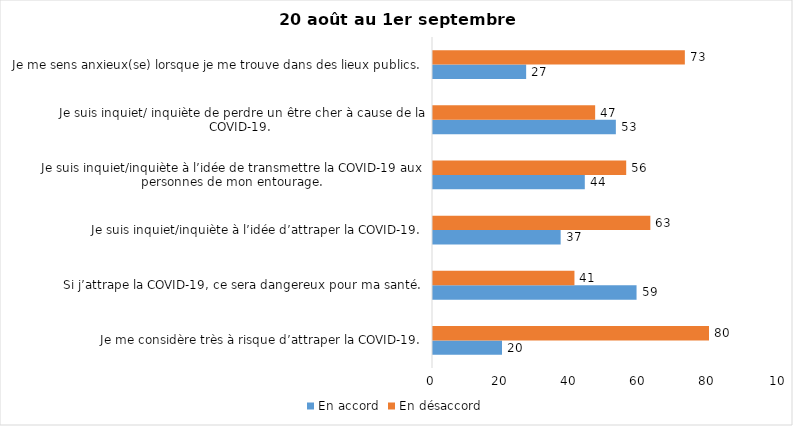
| Category | En accord | En désaccord |
|---|---|---|
| Je me considère très à risque d’attraper la COVID-19. | 20 | 80 |
| Si j’attrape la COVID-19, ce sera dangereux pour ma santé. | 59 | 41 |
| Je suis inquiet/inquiète à l’idée d’attraper la COVID-19. | 37 | 63 |
| Je suis inquiet/inquiète à l’idée de transmettre la COVID-19 aux personnes de mon entourage. | 44 | 56 |
| Je suis inquiet/ inquiète de perdre un être cher à cause de la COVID-19. | 53 | 47 |
| Je me sens anxieux(se) lorsque je me trouve dans des lieux publics. | 27 | 73 |